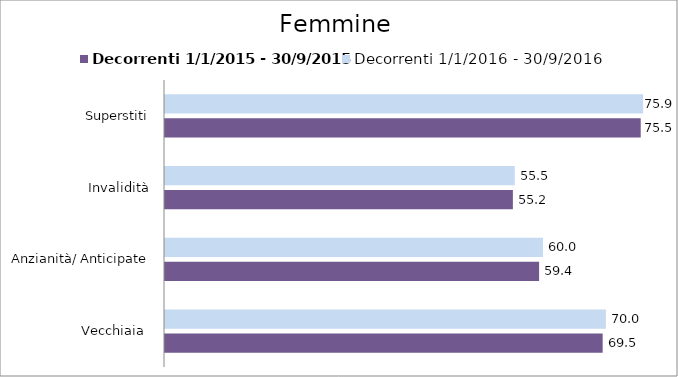
| Category | Decorrenti 1/1/2015 - 30/9/2015 | Decorrenti 1/1/2016 - 30/9/2016 |
|---|---|---|
| Vecchiaia  | 69.47 | 69.98 |
| Anzianità/ Anticipate | 59.38 | 60 |
| Invalidità | 55.22 | 55.52 |
| Superstiti | 75.51 | 75.89 |